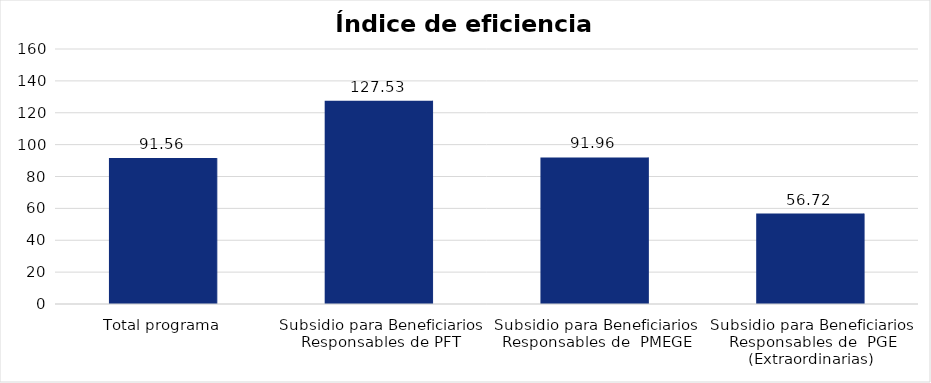
| Category | Índice de eficiencia (IE)  |
|---|---|
| Total programa | 91.556 |
| Subsidio para Beneficiarios Responsables de PFT | 127.532 |
| Subsidio para Beneficiarios Responsables de  PMEGE | 91.959 |
| Subsidio para Beneficiarios Responsables de  PGE (Extraordinarias) | 56.721 |